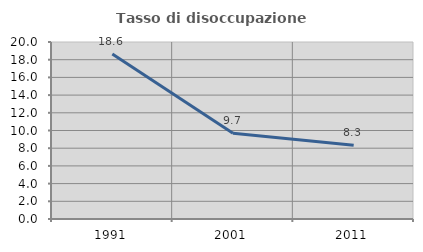
| Category | Tasso di disoccupazione giovanile  |
|---|---|
| 1991.0 | 18.644 |
| 2001.0 | 9.677 |
| 2011.0 | 8.333 |